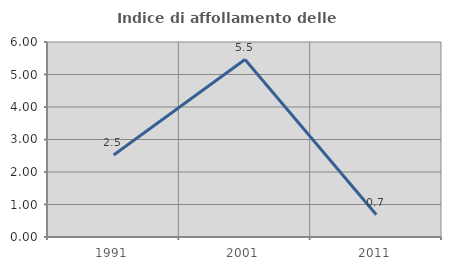
| Category | Indice di affollamento delle abitazioni  |
|---|---|
| 1991.0 | 2.524 |
| 2001.0 | 5.461 |
| 2011.0 | 0.687 |